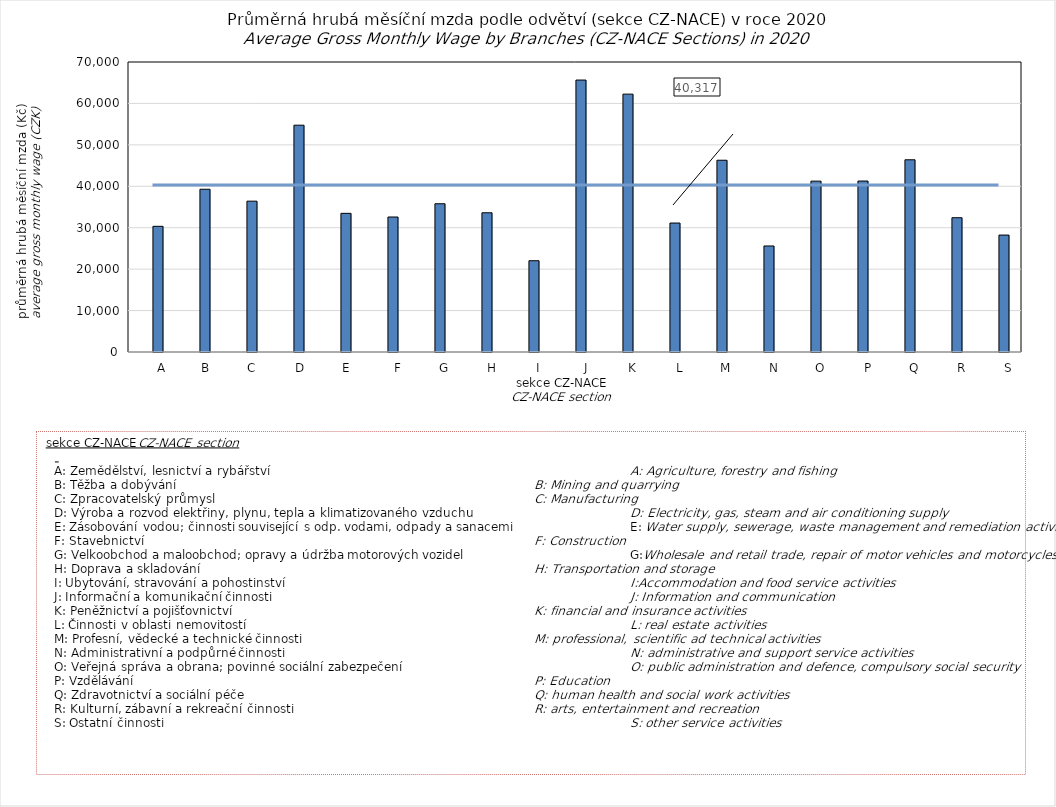
| Category | Series 0 | Series 11 |
|---|---|---|
|       A |  | 30337 |
|     B |  | 39288 |
|     C |  | 36407 |
|     D |  | 54745 |
|     E |  | 33465 |
|       F |  | 32583 |
|       G |  | 35783 |
|       H |  | 33606 |
|       I |  | 22032 |
|       J |  | 65641 |
|       K |  | 62244 |
|       L |  | 31130 |
|       M |  | 46285 |
|       N |  | 25590 |
|       O |  | 41242 |
|       P |  | 41267 |
|       Q |  | 46397 |
|       R |  | 32411 |
|       S |  | 28226 |